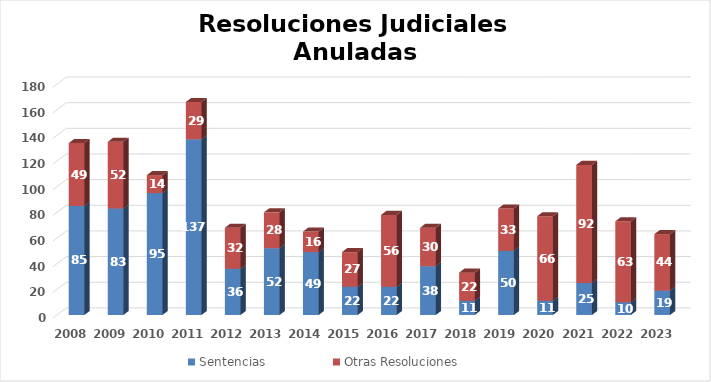
| Category | Sentencias | Otras Resoluciones |
|---|---|---|
| 2008.0 | 85 | 49 |
| 2009.0 | 83 | 52 |
| 2010.0 | 95 | 14 |
| 2011.0 | 137 | 29 |
| 2012.0 | 36 | 32 |
| 2013.0 | 52 | 28 |
| 2014.0 | 49 | 16 |
| 2015.0 | 22 | 27 |
| 2016.0 | 22 | 56 |
| 2017.0 | 38 | 30 |
| 2018.0 | 11 | 22 |
| 2019.0 | 50 | 33 |
| 2020.0 | 11 | 66 |
| 2021.0 | 25 | 92 |
| 2022.0 | 10 | 63 |
| 2023.0 | 19 | 44 |